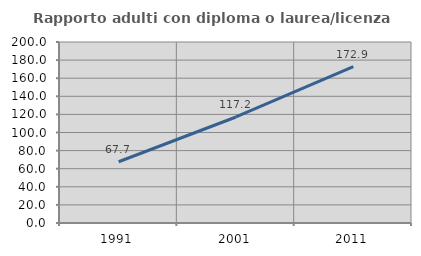
| Category | Rapporto adulti con diploma o laurea/licenza media  |
|---|---|
| 1991.0 | 67.689 |
| 2001.0 | 117.156 |
| 2011.0 | 172.861 |